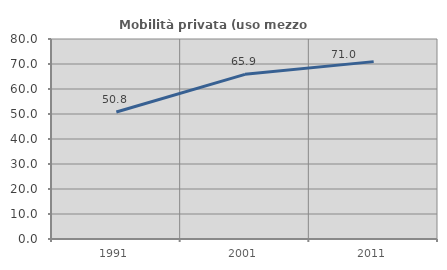
| Category | Mobilità privata (uso mezzo privato) |
|---|---|
| 1991.0 | 50.819 |
| 2001.0 | 65.867 |
| 2011.0 | 70.95 |